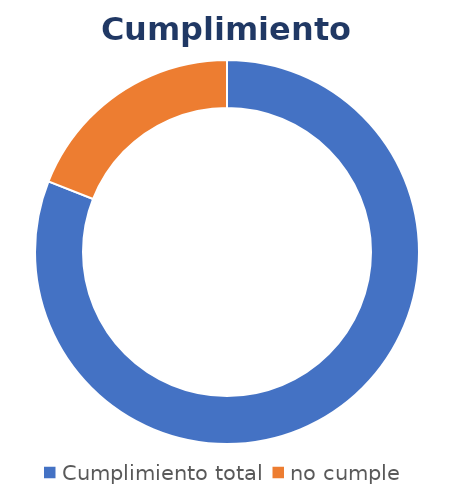
| Category | Series 0 |
|---|---|
| Cumplimiento total | 0.81 |
| no cumple | 0.19 |